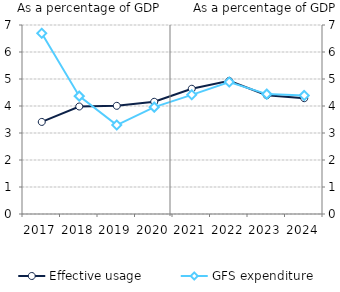
| Category | Effective usage |
|---|---|
| 2017.0 | 3.41 |
| 2018.0 | 3.982 |
| 2019.0 | 4.006 |
| 2020.0 | 4.156 |
| 2021.0 | 4.639 |
| 2022.0 | 4.93 |
| 2023.0 | 4.399 |
| 2024.0 | 4.289 |